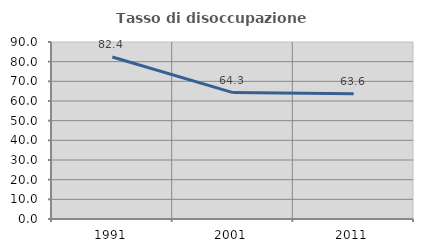
| Category | Tasso di disoccupazione giovanile  |
|---|---|
| 1991.0 | 82.353 |
| 2001.0 | 64.286 |
| 2011.0 | 63.636 |